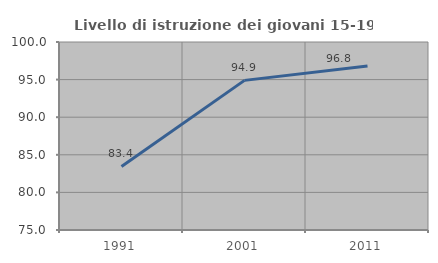
| Category | Livello di istruzione dei giovani 15-19 anni |
|---|---|
| 1991.0 | 83.45 |
| 2001.0 | 94.898 |
| 2011.0 | 96.813 |